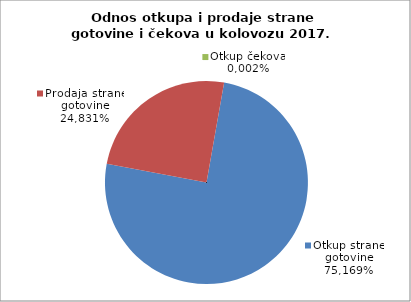
| Category | Otkup strane gotovine |
|---|---|
| 0 | 0.752 |
| 1 | 0.248 |
| 2 | 0 |